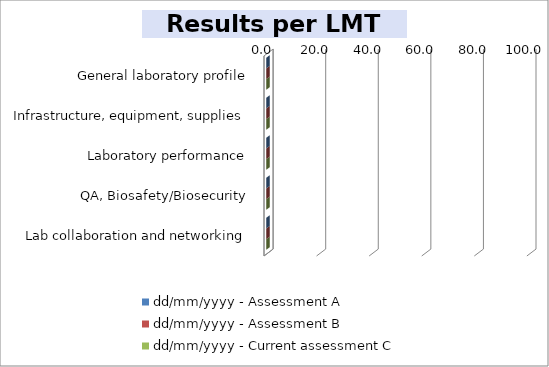
| Category | dd/mm/yyyy - Assessment A  | dd/mm/yyyy - Assessment B | dd/mm/yyyy - Current assessment C  |
|---|---|---|---|
| General laboratory profile | 0 | 0 | 0 |
| Infrastructure, equipment, supplies | 0 | 0 | 0 |
| Laboratory performance | 0 | 0 | 0 |
| QA, Biosafety/Biosecurity | 0 | 0 | 0 |
| Lab collaboration and networking | 0 | 0 | 0 |